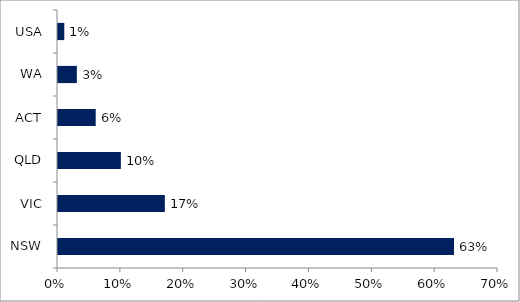
| Category | Series 0 |
|---|---|
| NSW | 0.63 |
| VIC | 0.17 |
| QLD | 0.1 |
| ACT | 0.06 |
| WA | 0.03 |
| USA | 0.01 |